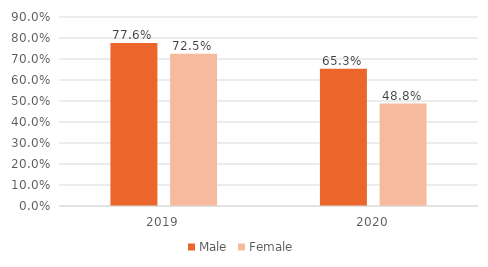
| Category | Male | Female |
|---|---|---|
| 2019.0 | 0.776 | 0.725 |
| 2020.0 | 0.653 | 0.488 |